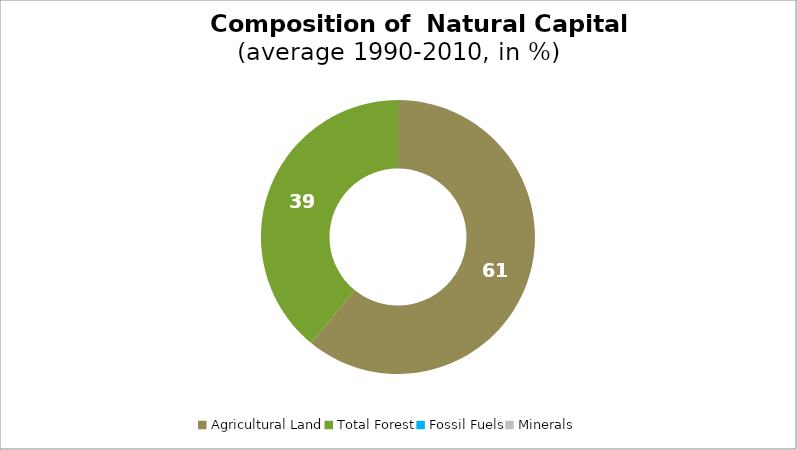
| Category | Series 0 |
|---|---|
| Agricultural Land | 60.933 |
| Total Forest | 39.067 |
| Fossil Fuels | 0 |
| Minerals | 0 |